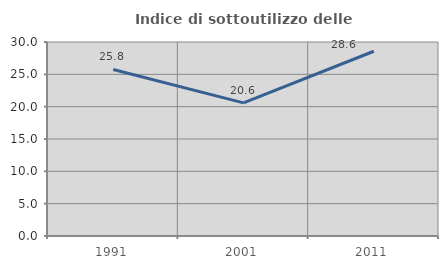
| Category | Indice di sottoutilizzo delle abitazioni  |
|---|---|
| 1991.0 | 25.758 |
| 2001.0 | 20.588 |
| 2011.0 | 28.571 |